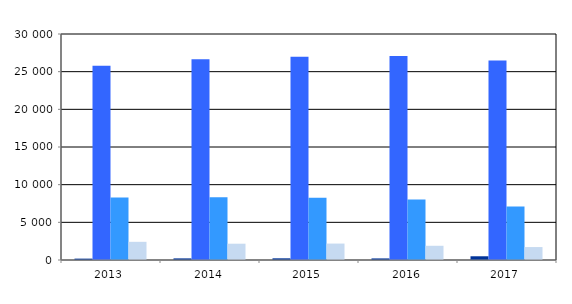
| Category | Series 0 | Series 1 | Series 2 | Series 3 |
|---|---|---|---|---|
| 2013.0 | 182 | 25772 | 8298 | 2412 |
| 2014.0 | 214 | 26643 | 8323 | 2163 |
| 2015.0 | 223 | 26966 | 8259 | 2181 |
| 2016.0 | 210 | 27066 | 8044 | 1887 |
| 2017.0 | 495 | 26495 | 7116 | 1718 |